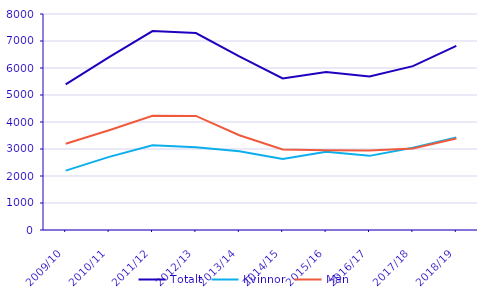
| Category | Totalt | Kvinnor | Män |
|---|---|---|---|
| 2009/10 | 5392 | 2198 | 3194 |
| 2010/11 | 6404 | 2708 | 3696 |
| 2011/12 | 7369 | 3142 | 4227 |
| 2012/13 | 7294 | 3068 | 4226 |
| 2013/14 | 6427 | 2916 | 3511 |
| 2014/15 | 5614 | 2633 | 2981 |
| 2015/16 | 5848 | 2898 | 2950 |
| 2016/17 | 5686 | 2746 | 2940 |
| 2017/18 | 6070 | 3048 | 3022 |
| 2018/19 | 6817 | 3427 | 3390 |